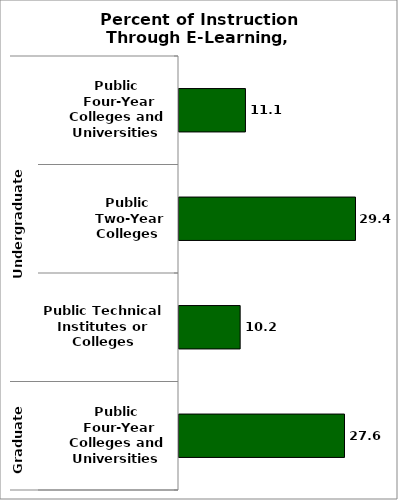
| Category | State |
|---|---|
| 0 | 11.074 |
| 1 | 29.415 |
| 2 | 10.193 |
| 3 | 27.581 |